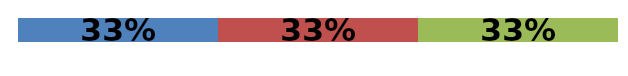
| Category | Series 0 | Series 1 | Series 2 |
|---|---|---|---|
| 0 | 0.333 | 0.333 | 0.333 |